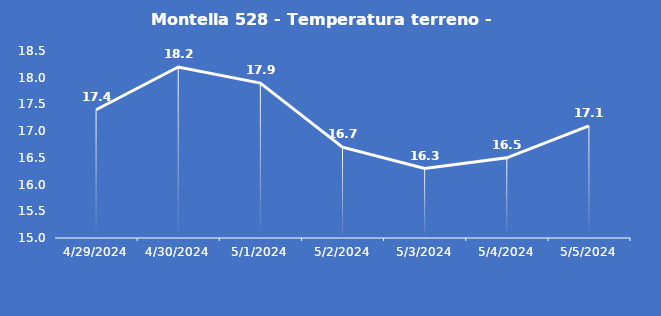
| Category | Montella 528 - Temperatura terreno - Grezzo (°C) |
|---|---|
| 4/29/24 | 17.4 |
| 4/30/24 | 18.2 |
| 5/1/24 | 17.9 |
| 5/2/24 | 16.7 |
| 5/3/24 | 16.3 |
| 5/4/24 | 16.5 |
| 5/5/24 | 17.1 |